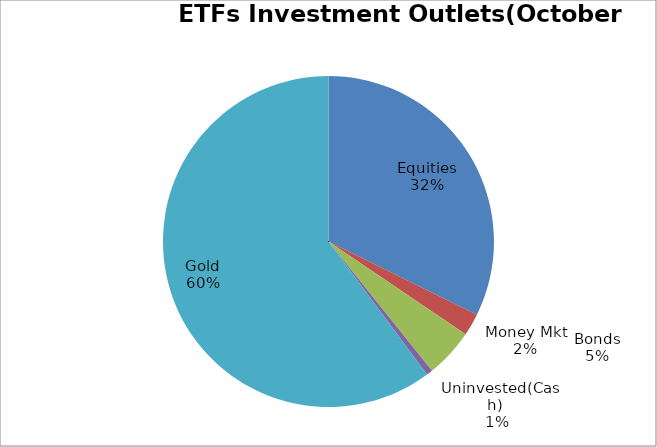
| Category | Series 0 |
|---|---|
| Equities | 5094516142.04 |
| Money Mkt | 343013633.71 |
| Bonds | 754956015.68 |
| Uninvested(Cash) | 94333366.41 |
| Gold | 9489073502.64 |